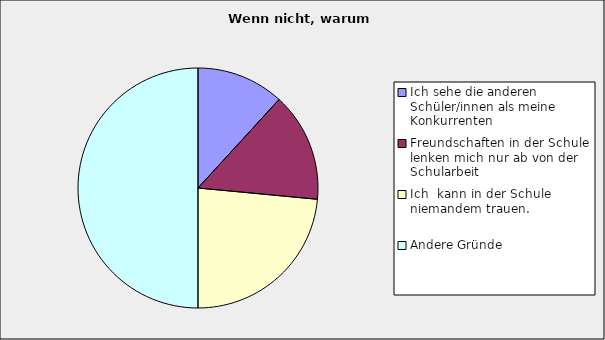
| Category | Series 0 |
|---|---|
| Ich sehe die anderen Schüler/innen als meine Konkurrenten | 0.118 |
| Freundschaften in der Schule lenken mich nur ab von der Schularbeit | 0.147 |
| Ich  kann in der Schule niemandem trauen. | 0.235 |
| Andere Gründe | 0.5 |